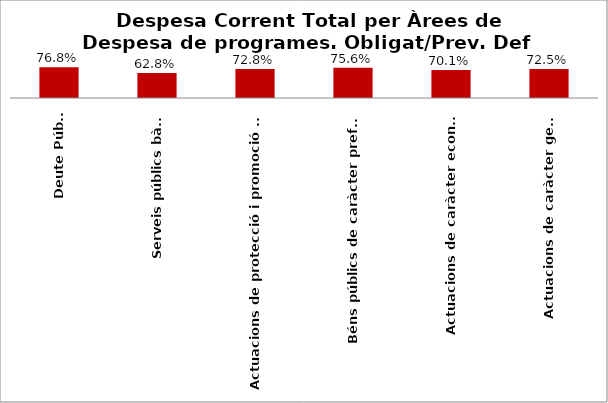
| Category | Series 0 |
|---|---|
| Deute Públic | 0.768 |
| Serveis públics bàsics | 0.628 |
| Actuacions de protecció i promoció social | 0.728 |
| Béns públics de caràcter preferent | 0.756 |
| Actuacions de caràcter econòmic | 0.701 |
| Actuacions de caràcter general | 0.725 |